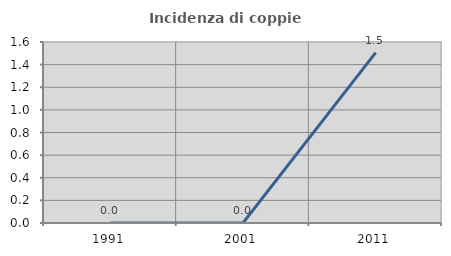
| Category | Incidenza di coppie miste |
|---|---|
| 1991.0 | 0 |
| 2001.0 | 0 |
| 2011.0 | 1.506 |